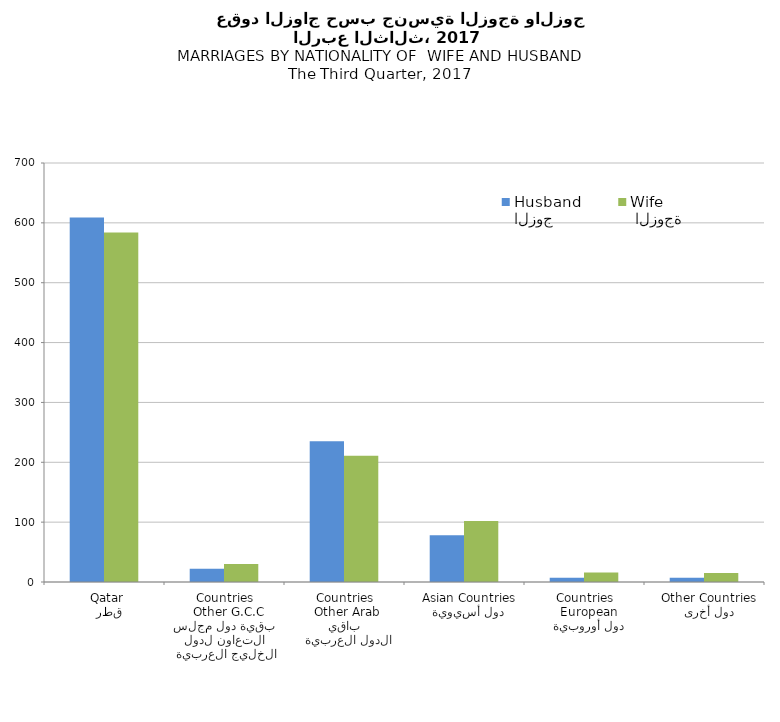
| Category | الزوج
Husband |  الزوجة
Wife |
|---|---|---|
|   قطر
 Qatar | 609 | 584 |
|  بقية دول مجلس التعاون لدول الخليج العربية
  Other G.C.C Countries | 22 | 30 |
|   باقي الدول العربية
 Other Arab Countries | 235 | 211 |
|   دول أسيوية
  Asian Countries | 78 | 102 |
|   دول أوروبية
  European Countries | 7 | 16 |
|   دول أخرى
  Other Countries | 7 | 15 |